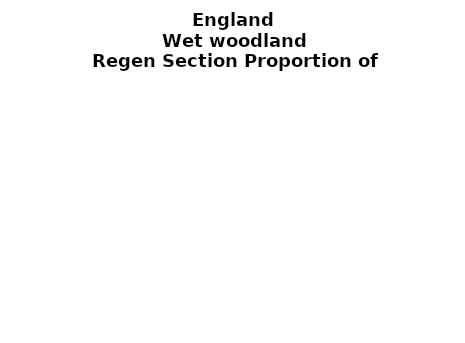
| Category | Wet woodland |
|---|---|
| None | 0.09 |
| Seedlings only | 0 |
| Seedlings, saplings only | 0.015 |
| Seedlings, saplings, <7 cm trees | 0.099 |
| Saplings only | 0.262 |
| <7 cm trees, seedlings only | 0 |
| <7 cm trees, saplings only | 0.448 |
| <7 cm Trees only | 0.086 |